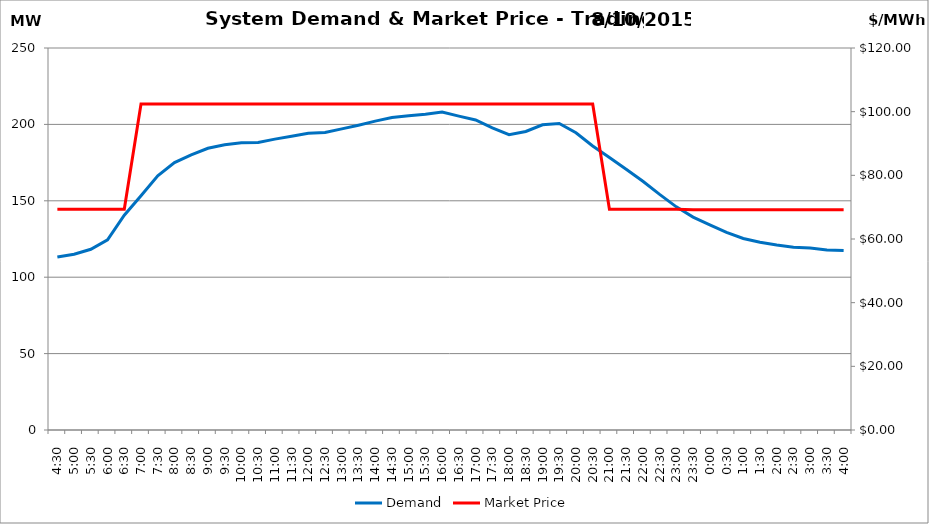
| Category | Demand |
|---|---|
| 0.1875 | 113.2 |
| 0.20833333333333334 | 115.02 |
| 0.22916666666666666 | 118.3 |
| 0.25 | 124.51 |
| 0.270833333333333 | 140.56 |
| 0.291666666666667 | 153.32 |
| 0.3125 | 166.36 |
| 0.333333333333333 | 175 |
| 0.354166666666667 | 180.1 |
| 0.375 | 184.35 |
| 0.395833333333333 | 186.7 |
| 0.416666666666667 | 188.06 |
| 0.4375 | 188.23 |
| 0.458333333333333 | 190.35 |
| 0.479166666666667 | 192.21 |
| 0.5 | 194.21 |
| 0.520833333333333 | 194.67 |
| 0.541666666666667 | 197.08 |
| 0.5625 | 199.48 |
| 0.583333333333333 | 202.13 |
| 0.604166666666667 | 204.49 |
| 0.625 | 205.7 |
| 0.645833333333334 | 206.68 |
| 0.666666666666667 | 208.06 |
| 0.6875 | 205.41 |
| 0.708333333333334 | 202.92 |
| 0.729166666666667 | 197.74 |
| 0.75 | 193.28 |
| 0.770833333333334 | 195.38 |
| 0.791666666666667 | 199.76 |
| 0.8125 | 200.61 |
| 0.833333333333334 | 194.52 |
| 0.854166666666667 | 185.89 |
| 0.875 | 178.27 |
| 0.895833333333334 | 170.66 |
| 0.916666666666667 | 162.8 |
| 0.9375 | 154.19 |
| 0.958333333333334 | 146.04 |
| 0.979166666666667 | 139.3 |
| 1900-01-01 | 134.25 |
| 1900-01-01 00:30:00 | 129.27 |
| 1900-01-01 01:00:00 | 125.32 |
| 1900-01-01 01:30:00 | 122.92 |
| 1900-01-01 02:00:00 | 121.11 |
| 1900-01-01 02:30:00 | 119.6 |
| 1900-01-01 03:00:00 | 119.11 |
| 1900-01-01 03:30:00 | 117.75 |
| 1900-01-01 04:00:00 | 117.45 |